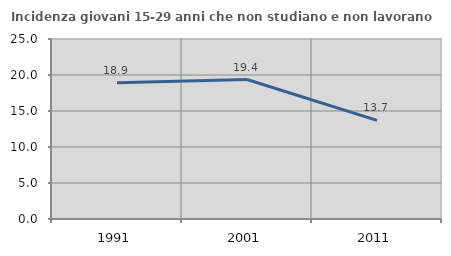
| Category | Incidenza giovani 15-29 anni che non studiano e non lavorano  |
|---|---|
| 1991.0 | 18.919 |
| 2001.0 | 19.372 |
| 2011.0 | 13.69 |